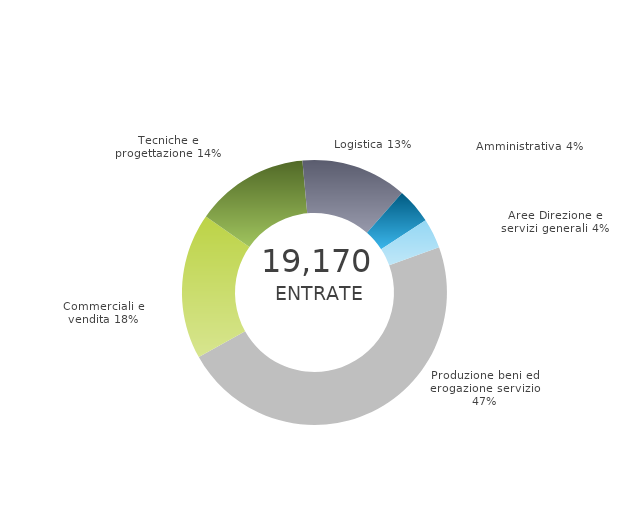
| Category | Series 0 | Series 1 |
|---|---|---|
| Produzione beni ed erogazione servizio | 0 | 0.475 |
| Commerciali e vendita | 0 | 0.178 |
| Tecniche e progettazione | 0 | 0.138 |
| Logistica | 0 | 0.129 |
| Amministrativa | 0 | 0.044 |
| Aree Direzione e servizi generali | 0 | 0.036 |